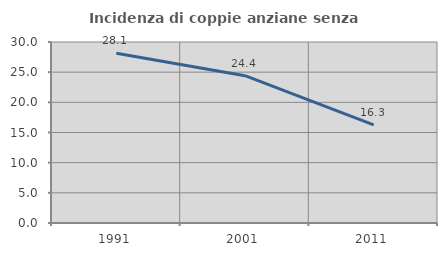
| Category | Incidenza di coppie anziane senza figli  |
|---|---|
| 1991.0 | 28.125 |
| 2001.0 | 24.419 |
| 2011.0 | 16.25 |